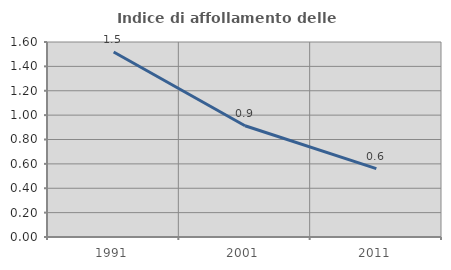
| Category | Indice di affollamento delle abitazioni  |
|---|---|
| 1991.0 | 1.517 |
| 2001.0 | 0.913 |
| 2011.0 | 0.561 |